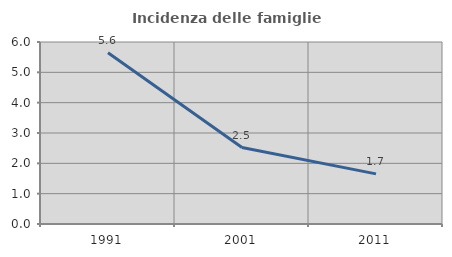
| Category | Incidenza delle famiglie numerose |
|---|---|
| 1991.0 | 5.647 |
| 2001.0 | 2.52 |
| 2011.0 | 1.652 |